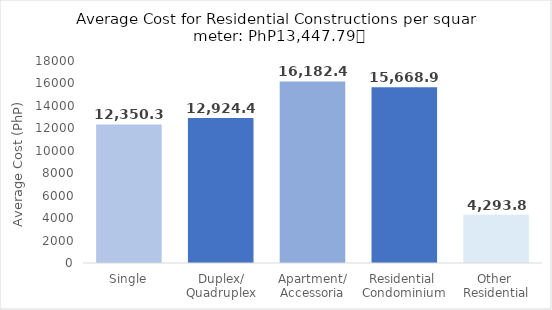
| Category | No |
|---|---|
| Single | 12350.394 |
| Duplex/
Quadruplex | 12924.491 |
| Apartment/
Accessoria | 16182.449 |
| Residential 
Condominium | 15668.92 |
| Other 
Residential | 4293.88 |